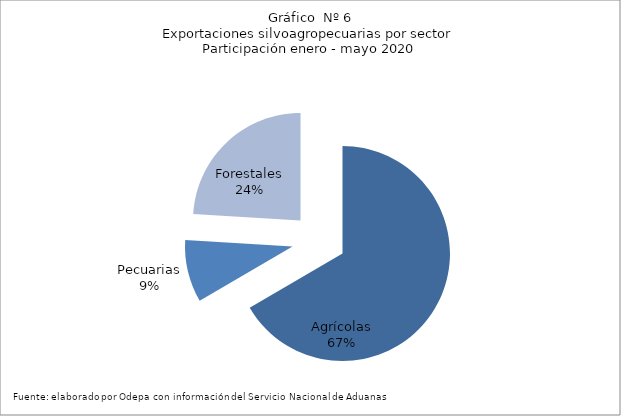
| Category | Series 0 |
|---|---|
| Agrícolas | 4776620 |
| Pecuarias | 673312 |
| Forestales | 1723685 |